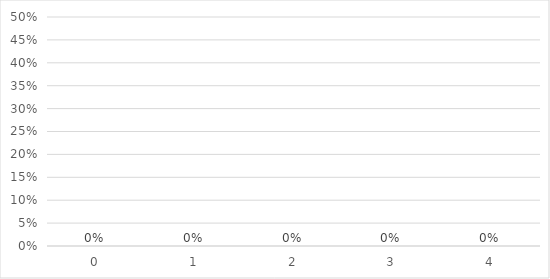
| Category | Payroll % |
|---|---|
| 0.0 | 0 |
| 1.0 | 0 |
| 2.0 | 0 |
| 3.0 | 0 |
| 4.0 | 0 |